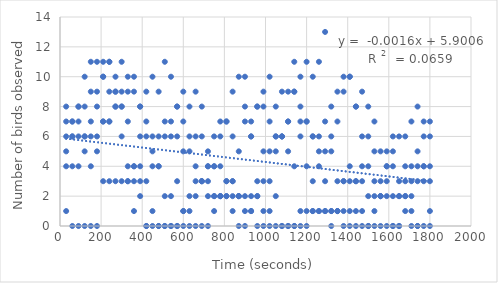
| Category | Series 0 |
|---|---|
| 30.0 | 4 |
| 60.0 | 4 |
| 90.0 | 4 |
| 120.0 | 6 |
| 150.0 | 7 |
| 180.0 | 8 |
| 210.0 | 10 |
| 240.0 | 11 |
| 270.0 | 9 |
| 300.0 | 8 |
| 330.0 | 10 |
| 360.0 | 9 |
| 390.0 | 8 |
| 420.0 | 7 |
| 450.0 | 6 |
| 480.0 | 6 |
| 510.0 | 6 |
| 540.0 | 7 |
| 570.0 | 8 |
| 600.0 | 9 |
| 630.0 | 8 |
| 660.0 | 6 |
| 690.0 | 6 |
| 720.0 | 5 |
| 750.0 | 6 |
| 780.0 | 6 |
| 810.0 | 7 |
| 840.0 | 6 |
| 870.0 | 5 |
| 900.0 | 8 |
| 930.0 | 6 |
| 960.0 | 8 |
| 990.0 | 9 |
| 1020.0 | 10 |
| 1050.0 | 8 |
| 1080.0 | 9 |
| 1110.0 | 9 |
| 1140.0 | 9 |
| 1170.0 | 8 |
| 1200.0 | 7 |
| 1230.0 | 6 |
| 1260.0 | 5 |
| 1290.0 | 3 |
| 1320.0 | 0 |
| 1350.0 | 1 |
| 1380.0 | 3 |
| 1410.0 | 3 |
| 1440.0 | 3 |
| 1470.0 | 4 |
| 1500.0 | 4 |
| 1530.0 | 3 |
| 1560.0 | 3 |
| 1590.0 | 3 |
| 1620.0 | 0 |
| 1650.0 | 0 |
| 1680.0 | 3 |
| 1710.0 | 3 |
| 1740.0 | 3 |
| 1770.0 | 3 |
| 1800.0 | 4 |
| 30.0 | 5 |
| 60.0 | 6 |
| 90.0 | 8 |
| 120.0 | 10 |
| 150.0 | 11 |
| 180.0 | 11 |
| 210.0 | 11 |
| 240.0 | 11 |
| 270.0 | 9 |
| 300.0 | 11 |
| 330.0 | 7 |
| 360.0 | 4 |
| 390.0 | 4 |
| 420.0 | 3 |
| 450.0 | 4 |
| 480.0 | 4 |
| 510.0 | 7 |
| 540.0 | 6 |
| 570.0 | 8 |
| 600.0 | 7 |
| 630.0 | 6 |
| 660.0 | 9 |
| 690.0 | 8 |
| 720.0 | 4 |
| 750.0 | 4 |
| 780.0 | 7 |
| 810.0 | 7 |
| 840.0 | 9 |
| 870.0 | 10 |
| 900.0 | 10 |
| 930.0 | 7 |
| 960.0 | 8 |
| 990.0 | 8 |
| 1020.0 | 7 |
| 1050.0 | 6 |
| 1080.0 | 6 |
| 1110.0 | 7 |
| 1140.0 | 11 |
| 1170.0 | 10 |
| 1200.0 | 11 |
| 1230.0 | 10 |
| 1260.0 | 11 |
| 1290.0 | 13 |
| 1320.0 | 6 |
| 1350.0 | 3 |
| 1380.0 | 3 |
| 1410.0 | 4 |
| 1440.0 | 3 |
| 1470.0 | 3 |
| 1500.0 | 2 |
| 1530.0 | 2 |
| 1560.0 | 2 |
| 1590.0 | 4 |
| 1620.0 | 5 |
| 1650.0 | 2 |
| 1680.0 | 2 |
| 1710.0 | 1 |
| 1740.0 | 0 |
| 1770.0 | 4 |
| 1800.0 | 1 |
| 30.0 | 1 |
| 60.0 | 0 |
| 90.0 | 0 |
| 120.0 | 0 |
| 150.0 | 0 |
| 180.0 | 0 |
| 210.0 | 3 |
| 240.0 | 3 |
| 270.0 | 3 |
| 300.0 | 3 |
| 330.0 | 3 |
| 360.0 | 3 |
| 390.0 | 3 |
| 420.0 | 0 |
| 450.0 | 0 |
| 480.0 | 0 |
| 510.0 | 0 |
| 540.0 | 0 |
| 570.0 | 0 |
| 600.0 | 0 |
| 630.0 | 0 |
| 660.0 | 0 |
| 690.0 | 0 |
| 720.0 | 0 |
| 750.0 | 1 |
| 780.0 | 2 |
| 810.0 | 2 |
| 840.0 | 2 |
| 870.0 | 2 |
| 900.0 | 1 |
| 930.0 | 1 |
| 960.0 | 2 |
| 990.0 | 3 |
| 1020.0 | 3 |
| 1050.0 | 6 |
| 1080.0 | 6 |
| 1110.0 | 7 |
| 1140.0 | 9 |
| 1170.0 | 7 |
| 1200.0 | 7 |
| 1230.0 | 6 |
| 1260.0 | 4 |
| 1290.0 | 5 |
| 1320.0 | 5 |
| 1350.0 | 7 |
| 1380.0 | 9 |
| 1410.0 | 10 |
| 1440.0 | 8 |
| 1470.0 | 9 |
| 1500.0 | 8 |
| 1530.0 | 5 |
| 1560.0 | 2 |
| 1590.0 | 4 |
| 1620.0 | 4 |
| 1650.0 | 3 |
| 1680.0 | 6 |
| 1710.0 | 7 |
| 1740.0 | 8 |
| 1770.0 | 7 |
| 1800.0 | 7 |
| 30.0 | 8 |
| 60.0 | 6 |
| 90.0 | 6 |
| 120.0 | 5 |
| 150.0 | 4 |
| 180.0 | 5 |
| 210.0 | 7 |
| 240.0 | 7 |
| 270.0 | 8 |
| 300.0 | 6 |
| 330.0 | 3 |
| 360.0 | 1 |
| 390.0 | 2 |
| 420.0 | 0 |
| 450.0 | 1 |
| 480.0 | 0 |
| 510.0 | 0 |
| 540.0 | 0 |
| 570.0 | 0 |
| 600.0 | 1 |
| 630.0 | 1 |
| 660.0 | 2 |
| 690.0 | 3 |
| 720.0 | 4 |
| 750.0 | 4 |
| 780.0 | 4 |
| 810.0 | 3 |
| 840.0 | 3 |
| 870.0 | 2 |
| 900.0 | 7 |
| 930.0 | 6 |
| 960.0 | 3 |
| 990.0 | 5 |
| 1020.0 | 5 |
| 1050.0 | 5 |
| 1080.0 | 6 |
| 1110.0 | 5 |
| 1140.0 | 4 |
| 1170.0 | 6 |
| 1200.0 | 4 |
| 1230.0 | 3 |
| 1260.0 | 6 |
| 1290.0 | 7 |
| 1320.0 | 8 |
| 1350.0 | 9 |
| 1380.0 | 10 |
| 1410.0 | 10 |
| 1440.0 | 8 |
| 1470.0 | 6 |
| 1500.0 | 6 |
| 1530.0 | 7 |
| 1560.0 | 5 |
| 1590.0 | 5 |
| 1620.0 | 6 |
| 1650.0 | 6 |
| 1680.0 | 4 |
| 1710.0 | 4 |
| 1740.0 | 5 |
| 1770.0 | 6 |
| 1800.0 | 6 |
| 30.0 | 7 |
| 60.0 | 7 |
| 90.0 | 8 |
| 120.0 | 8 |
| 150.0 | 9 |
| 180.0 | 9 |
| 210.0 | 10 |
| 240.0 | 9 |
| 270.0 | 10 |
| 300.0 | 9 |
| 330.0 | 4 |
| 360.0 | 4 |
| 390.0 | 6 |
| 420.0 | 6 |
| 450.0 | 5 |
| 480.0 | 4 |
| 510.0 | 2 |
| 540.0 | 2 |
| 570.0 | 3 |
| 600.0 | 1 |
| 630.0 | 2 |
| 660.0 | 3 |
| 690.0 | 3 |
| 720.0 | 2 |
| 750.0 | 2 |
| 780.0 | 2 |
| 810.0 | 2 |
| 840.0 | 1 |
| 870.0 | 0 |
| 900.0 | 0 |
| 930.0 | 1 |
| 960.0 | 0 |
| 990.0 | 0 |
| 1020.0 | 0 |
| 1050.0 | 0 |
| 1080.0 | 0 |
| 1110.0 | 0 |
| 1140.0 | 0 |
| 1170.0 | 1 |
| 1200.0 | 1 |
| 1230.0 | 1 |
| 1260.0 | 1 |
| 1290.0 | 1 |
| 1320.0 | 1 |
| 1350.0 | 1 |
| 1380.0 | 1 |
| 1410.0 | 1 |
| 1440.0 | 1 |
| 1470.0 | 1 |
| 1500.0 | 0 |
| 1530.0 | 1 |
| 1560.0 | 2 |
| 1590.0 | 2 |
| 1620.0 | 2 |
| 1650.0 | 2 |
| 1680.0 | 2 |
| 1710.0 | 2 |
| 1740.0 | 4 |
| 1770.0 | 4 |
| 1800.0 | 3 |
| 30.0 | 6 |
| 60.0 | 7 |
| 90.0 | 7 |
| 120.0 | 6 |
| 150.0 | 6 |
| 180.0 | 6 |
| 210.0 | 7 |
| 240.0 | 7 |
| 270.0 | 8 |
| 300.0 | 8 |
| 330.0 | 9 |
| 360.0 | 10 |
| 390.0 | 8 |
| 420.0 | 9 |
| 450.0 | 10 |
| 480.0 | 9 |
| 510.0 | 11 |
| 540.0 | 10 |
| 570.0 | 6 |
| 600.0 | 5 |
| 630.0 | 5 |
| 660.0 | 4 |
| 690.0 | 3 |
| 720.0 | 3 |
| 750.0 | 2 |
| 780.0 | 2 |
| 810.0 | 3 |
| 840.0 | 3 |
| 870.0 | 2 |
| 900.0 | 2 |
| 930.0 | 2 |
| 960.0 | 2 |
| 990.0 | 1 |
| 1020.0 | 1 |
| 1050.0 | 2 |
| 1080.0 | 0 |
| 1110.0 | 0 |
| 1140.0 | 0 |
| 1170.0 | 0 |
| 1200.0 | 0 |
| 1230.0 | 1 |
| 1260.0 | 1 |
| 1290.0 | 1 |
| 1320.0 | 1 |
| 1350.0 | 1 |
| 1380.0 | 0 |
| 1410.0 | 0 |
| 1440.0 | 0 |
| 1470.0 | 0 |
| 1500.0 | 0 |
| 1530.0 | 0 |
| 1560.0 | 0 |
| 1590.0 | 0 |
| 1620.0 | 0 |
| 1650.0 | 0 |
| 1680.0 | 1 |
| 1710.0 | 0 |
| 1740.0 | 0 |
| 1770.0 | 0 |
| 1800.0 | 0 |